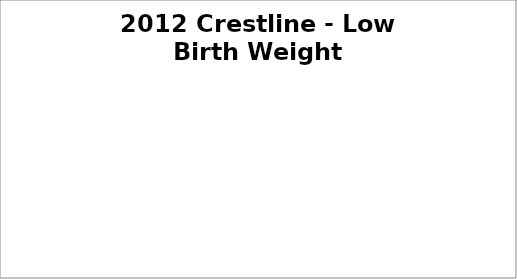
| Category | Series 0 |
|---|---|
| Births <2500 gm / 36 weeks or less | 0 |
| Births >2500 gm / 37 weeks or more | 0 |